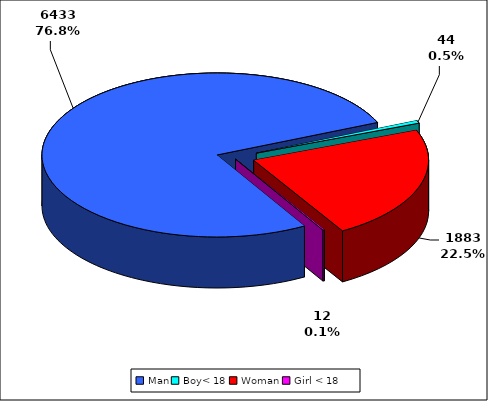
| Category | TOTAL |
|---|---|
| Man | 6433 |
| Boy< 18 | 44 |
| Woman | 1883 |
| Girl < 18 | 12 |